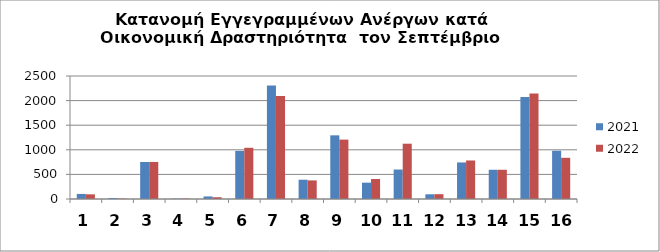
| Category | 2021 | 2022 |
|---|---|---|
| 0 | 103 | 95 |
| 1 | 20 | 9 |
| 2 | 752 | 753 |
| 3 | 7 | 9 |
| 4 | 52 | 36 |
| 5 | 978 | 1041 |
| 6 | 2309 | 2094 |
| 7 | 392 | 378 |
| 8 | 1294 | 1207 |
| 9 | 332 | 406 |
| 10 | 599 | 1124 |
| 11 | 96 | 98 |
| 12 | 743 | 783 |
| 13 | 594 | 594 |
| 14 | 2072 | 2146 |
| 15 | 981 | 837 |